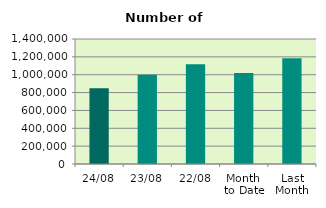
| Category | Series 0 |
|---|---|
| 24/08 | 848236 |
| 23/08 | 1000694 |
| 22/08 | 1118364 |
| Month 
to Date | 1018044 |
| Last
Month | 1183989.81 |